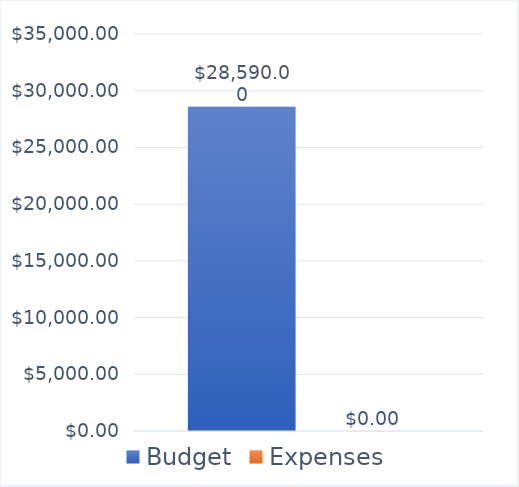
| Category | Budget | Expenses |
|---|---|---|
| 0 | 28590 | 0 |